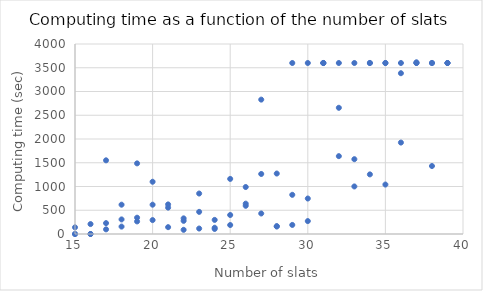
| Category | Series 0 |
|---|---|
| 15.0 | 0 |
| 15.0 | 0 |
| 15.0 | 140 |
| 16.0 | 209 |
| 16.0 | 0 |
| 16.0 | 0 |
| 17.0 | 98 |
| 17.0 | 1551 |
| 17.0 | 229 |
| 18.0 | 156 |
| 18.0 | 617 |
| 18.0 | 307 |
| 19.0 | 1487 |
| 19.0 | 265 |
| 19.0 | 343 |
| 20.0 | 1100 |
| 20.0 | 617 |
| 20.0 | 293 |
| 21.0 | 623 |
| 21.0 | 144 |
| 21.0 | 555 |
| 22.0 | 88 |
| 22.0 | 329 |
| 22.0 | 277 |
| 23.0 | 115 |
| 23.0 | 852 |
| 23.0 | 466 |
| 24.0 | 297 |
| 24.0 | 132 |
| 24.0 | 106 |
| 25.0 | 400 |
| 25.0 | 189 |
| 25.0 | 1160 |
| 26.0 | 639 |
| 26.0 | 594 |
| 26.0 | 989 |
| 27.0 | 432 |
| 27.0 | 2829 |
| 27.0 | 1264 |
| 28.0 | 1273 |
| 28.0 | 158 |
| 28.0 | 165 |
| 29.0 | 825 |
| 29.0 | 191 |
| 29.0 | 3600 |
| 30.0 | 272 |
| 30.0 | 3600 |
| 30.0 | 747 |
| 31.0 | 3600 |
| 31.0 | 3600 |
| 31.0 | 3600 |
| 32.0 | 2657 |
| 32.0 | 3600 |
| 32.0 | 1639 |
| 33.0 | 1001 |
| 33.0 | 3600 |
| 33.0 | 1575 |
| 34.0 | 3600 |
| 34.0 | 3600 |
| 34.0 | 1255 |
| 35.0 | 3600 |
| 35.0 | 1041 |
| 35.0 | 3600 |
| 36.0 | 3600 |
| 36.0 | 3385 |
| 36.0 | 1925 |
| 37.0 | 3600 |
| 37.0 | 3600 |
| 37.0 | 3615 |
| 38.0 | 1431 |
| 38.0 | 3600 |
| 38.0 | 3600 |
| 39.0 | 3600 |
| 39.0 | 3600 |
| 39.0 | 3600 |